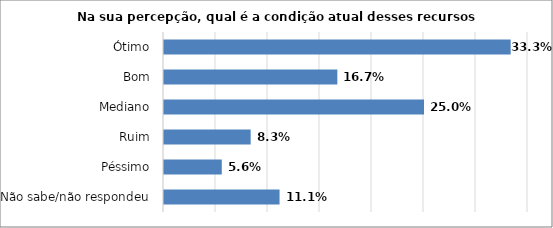
| Category | Series 0 |
|---|---|
| Não sabe/não respondeu | 0.111 |
| Péssimo | 0.056 |
| Ruim | 0.083 |
| Mediano | 0.25 |
| Bom | 0.167 |
| Ótimo | 0.333 |